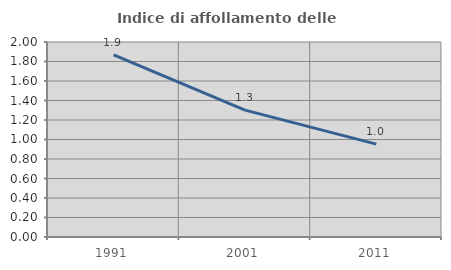
| Category | Indice di affollamento delle abitazioni  |
|---|---|
| 1991.0 | 1.867 |
| 2001.0 | 1.301 |
| 2011.0 | 0.952 |